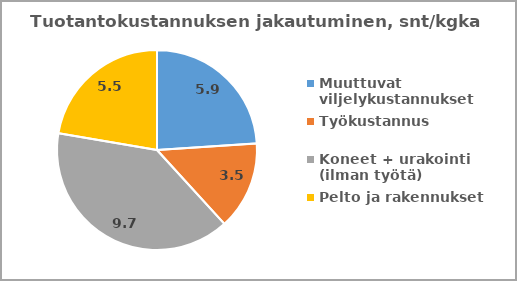
| Category | Series 0 |
|---|---|
| Muuttuvat viljelykustannukset | 5.874 |
| Työkustannus | 3.502 |
| Koneet + urakointi (ilman työtä) | 9.681 |
| Pelto ja rakennukset | 5.473 |